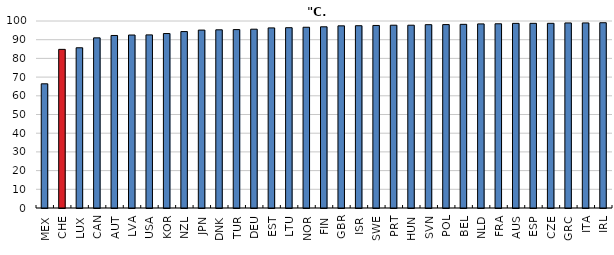
| Category | Series 0 |
|---|---|
| MEX | 66.419 |
| CHE | 84.83 |
| LUX | 85.686 |
| CAN | 90.982 |
| AUT | 92.258 |
| LVA | 92.498 |
| USA | 92.573 |
| KOR | 93.296 |
| NZL | 94.347 |
| JPN | 95.145 |
| DNK | 95.281 |
| TUR | 95.407 |
| DEU | 95.619 |
| EST | 96.312 |
| LTU | 96.42 |
| NOR | 96.655 |
| FIN | 96.899 |
| GBR | 97.407 |
| ISR | 97.483 |
| SWE | 97.617 |
| PRT | 97.747 |
| HUN | 97.749 |
| SVN | 98.037 |
| POL | 98.082 |
| BEL | 98.218 |
| NLD | 98.451 |
| FRA | 98.511 |
| AUS | 98.73 |
| ESP | 98.751 |
| CZE | 98.758 |
| GRC | 98.961 |
| ITA | 98.969 |
| IRL | 99.075 |